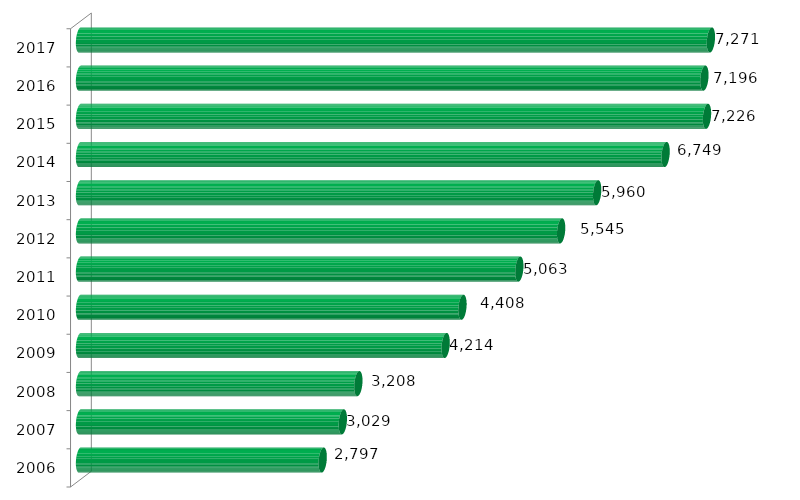
| Category | Número de matriculados |
|---|---|
| 2006.0 | 2797 |
| 2007.0 | 3029 |
| 2008.0 | 3208 |
| 2009.0 | 4214 |
| 2010.0 | 4408 |
| 2011.0 | 5063 |
| 2012.0 | 5545 |
| 2013.0 | 5960 |
| 2014.0 | 6749 |
| 2015.0 | 7226 |
| 2016.0 | 7196 |
| 2017.0 | 7271 |